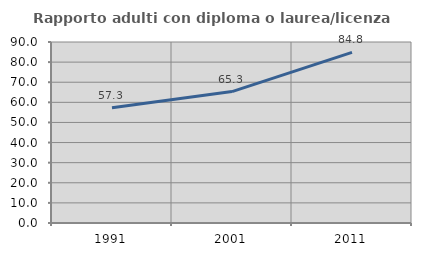
| Category | Rapporto adulti con diploma o laurea/licenza media  |
|---|---|
| 1991.0 | 57.258 |
| 2001.0 | 65.347 |
| 2011.0 | 84.808 |